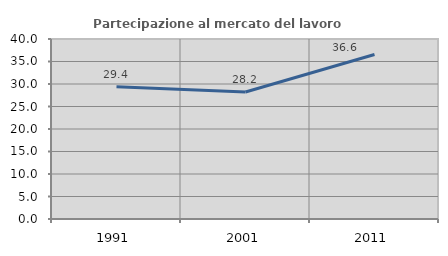
| Category | Partecipazione al mercato del lavoro  femminile |
|---|---|
| 1991.0 | 29.371 |
| 2001.0 | 28.232 |
| 2011.0 | 36.558 |